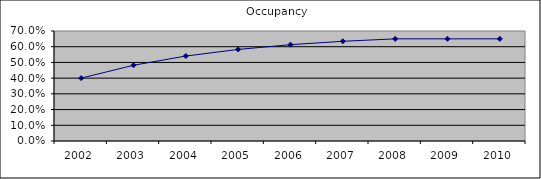
| Category | Occupancy |
|---|---|
| 2002.0 | 0.4 |
| 2003.0 | 0.482 |
| 2004.0 | 0.541 |
| 2005.0 | 0.583 |
| 2006.0 | 0.613 |
| 2007.0 | 0.635 |
| 2008.0 | 0.65 |
| 2009.0 | 0.65 |
| 2010.0 | 0.65 |